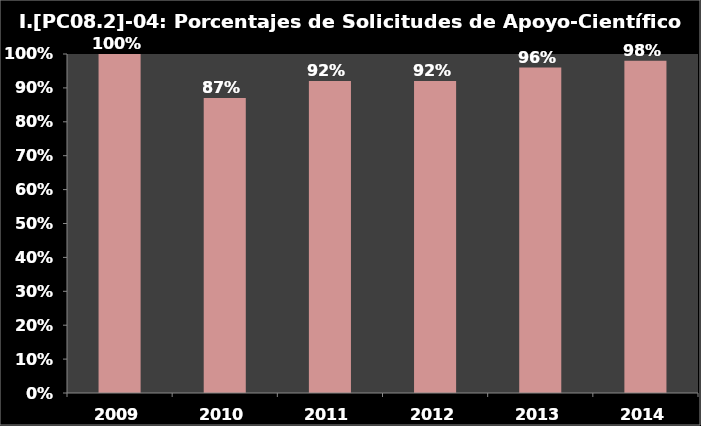
| Category | I.PC08.2-04 |
|---|---|
| 2009.0 | 1 |
| 2010.0 | 0.87 |
| 2011.0 | 0.92 |
| 2012.0 | 0.92 |
| 2013.0 | 0.96 |
| 2014.0 | 0.98 |